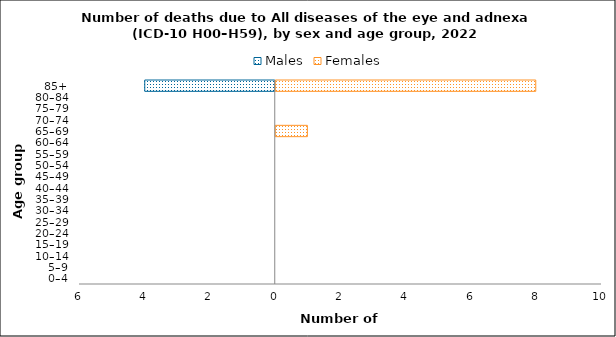
| Category | Males | Females |
|---|---|---|
| 0–4 | 0 | 0 |
| 5–9 | 0 | 0 |
| 10–14 | 0 | 0 |
| 15–19 | 0 | 0 |
| 20–24 | 0 | 0 |
| 25–29 | 0 | 0 |
| 30–34 | 0 | 0 |
| 35–39 | 0 | 0 |
| 40–44 | 0 | 0 |
| 45–49 | 0 | 0 |
| 50–54 | 0 | 0 |
| 55–59 | 0 | 0 |
| 60–64 | 0 | 0 |
| 65–69 | 0 | 1 |
| 70–74 | 0 | 0 |
| 75–79 | 0 | 0 |
| 80–84 | 0 | 0 |
| 85+ | -4 | 8 |